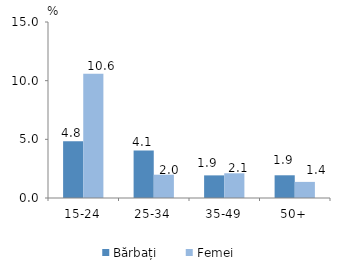
| Category | Bărbați | Femei |
|---|---|---|
| 15-24 | 4.835 | 10.586 |
| 25-34 | 4.051 | 1.986 |
| 35-49 | 1.928 | 2.106 |
| 50+ | 1.936 | 1.373 |